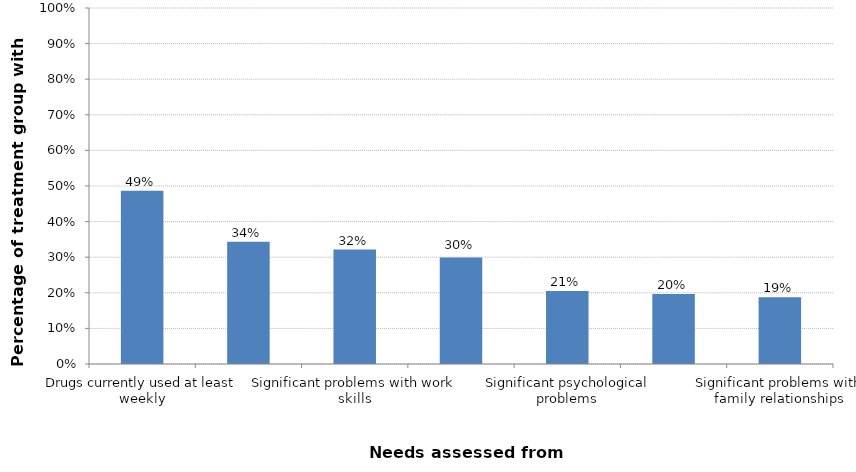
| Category | Percentage of treatment group with need |
|---|---|
| Drugs currently used at least weekly | 0.487 |
| Perpetrator or victim of domestic violence | 0.344 |
| Significant problems with work skills | 0.321 |
| No fixed abode | 0.299 |
| Significant psychological problems | 0.205 |
| Current use of alcohol a significant problem | 0.196 |
| Significant problems with family relationships | 0.188 |